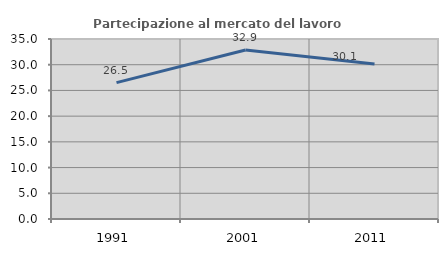
| Category | Partecipazione al mercato del lavoro  femminile |
|---|---|
| 1991.0 | 26.513 |
| 2001.0 | 32.852 |
| 2011.0 | 30.144 |